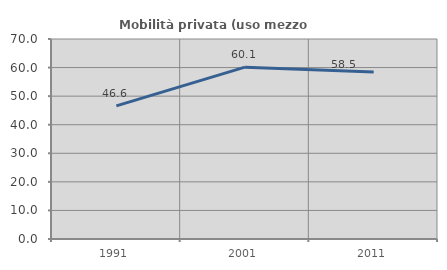
| Category | Mobilità privata (uso mezzo privato) |
|---|---|
| 1991.0 | 46.61 |
| 2001.0 | 60.14 |
| 2011.0 | 58.475 |